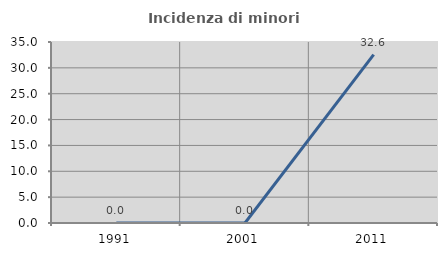
| Category | Incidenza di minori stranieri |
|---|---|
| 1991.0 | 0 |
| 2001.0 | 0 |
| 2011.0 | 32.558 |